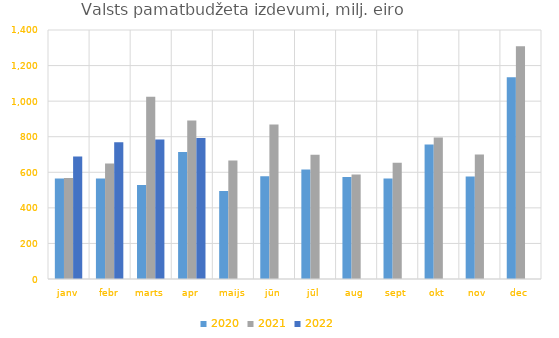
| Category | 2020 | 2021 | 2022 |
|---|---|---|---|
| janv | 564731.731 | 567519.181 | 689237.965 |
| febr | 564358.73 | 649337.389 | 769410.975 |
| marts | 528520.586 | 1024865.74 | 784728.56 |
| apr | 713875.034 | 890597.122 | 792151.693 |
| maijs | 494549.632 | 666390.632 | 0 |
| jūn | 578082.287 | 868998.418 | 0 |
| jūl | 616330.617 | 698429.777 | 0 |
| aug | 573848.626 | 587185.295 | 0 |
| sept | 565735.173 | 652999.82 | 0 |
| okt | 755917.602 | 795708.656 | 0 |
| nov | 576740.78 | 700002.359 | 0 |
| dec | 1134353.728 | 1308324.606 | 0 |